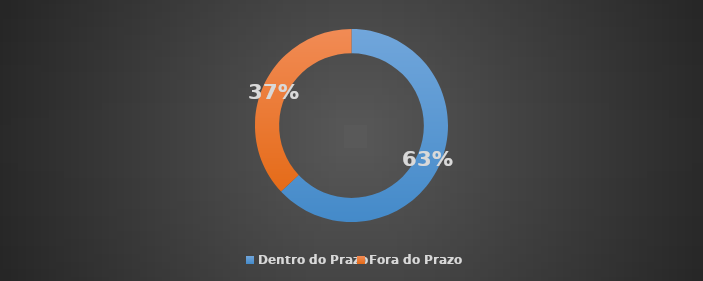
| Category | Total |
|---|---|
| Dentro do Prazo | 0.63 |
| Fora do Prazo | 0.37 |